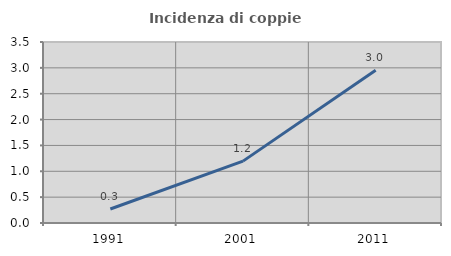
| Category | Incidenza di coppie miste |
|---|---|
| 1991.0 | 0.271 |
| 2001.0 | 1.197 |
| 2011.0 | 2.953 |